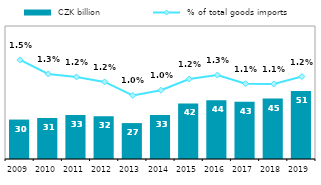
| Category |  CZK billion |
|---|---|
| 2009.0 | 29.644 |
| 2010.0 | 30.825 |
| 2011.0 | 33.166 |
| 2012.0 | 32.078 |
| 2013.0 | 27.003 |
| 2014.0 | 33.108 |
| 2015.0 | 41.813 |
| 2016.0 | 44.109 |
| 2017.0 | 43.031 |
| 2018.0 | 45.4 |
| 2019.0 | 51.065 |